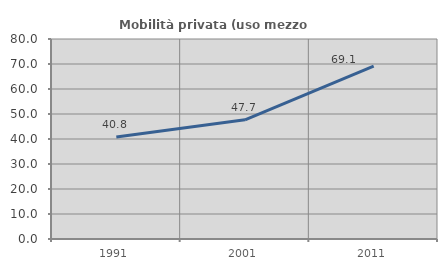
| Category | Mobilità privata (uso mezzo privato) |
|---|---|
| 1991.0 | 40.816 |
| 2001.0 | 47.674 |
| 2011.0 | 69.118 |